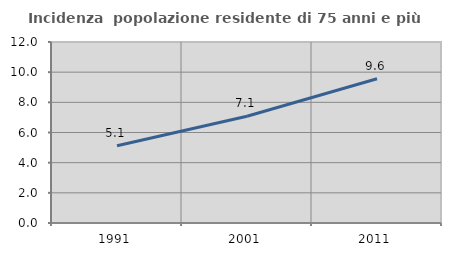
| Category | Incidenza  popolazione residente di 75 anni e più |
|---|---|
| 1991.0 | 5.119 |
| 2001.0 | 7.075 |
| 2011.0 | 9.561 |